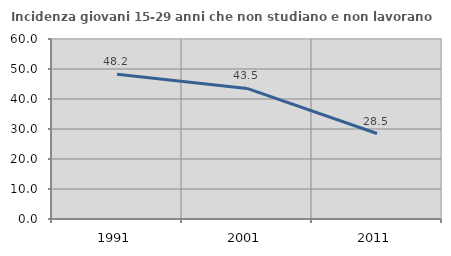
| Category | Incidenza giovani 15-29 anni che non studiano e non lavorano  |
|---|---|
| 1991.0 | 48.233 |
| 2001.0 | 43.519 |
| 2011.0 | 28.488 |